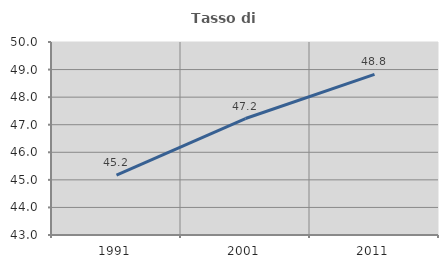
| Category | Tasso di occupazione   |
|---|---|
| 1991.0 | 45.169 |
| 2001.0 | 47.224 |
| 2011.0 | 48.826 |